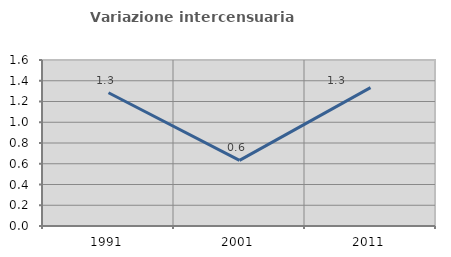
| Category | Variazione intercensuaria annua |
|---|---|
| 1991.0 | 1.284 |
| 2001.0 | 0.633 |
| 2011.0 | 1.334 |